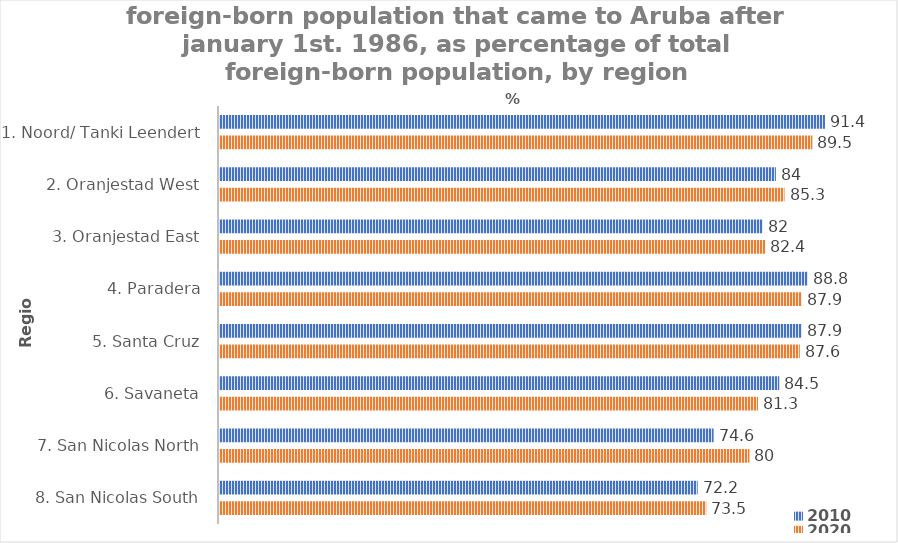
| Category | 2010 | 2020 |
|---|---|---|
| 1. Noord/ Tanki Leendert | 91.4 | 89.5 |
| 2. Oranjestad West | 84 | 85.3 |
| 3. Oranjestad East | 82 | 82.4 |
| 4. Paradera | 88.8 | 87.9 |
| 5. Santa Cruz | 87.9 | 87.6 |
| 6. Savaneta | 84.5 | 81.3 |
| 7. San Nicolas North | 74.6 | 80 |
| 8. San Nicolas South | 72.2 | 73.5 |